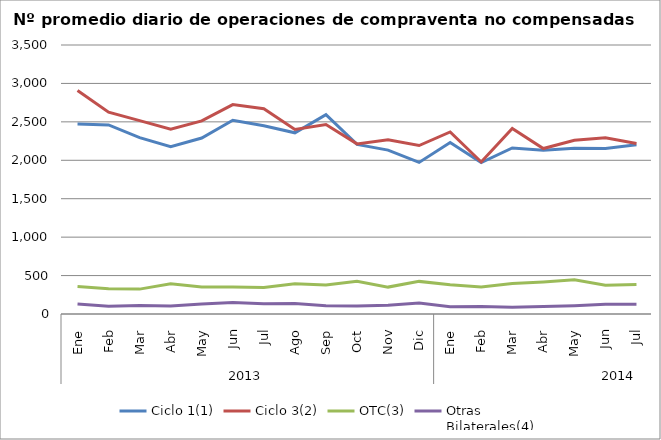
| Category | Ciclo 1(1) | Ciclo 3(2) | OTC(3) | Otras
Bilaterales(4) |
|---|---|---|---|---|
| 0 | 2472.091 | 2907.273 | 357.864 | 131.409 |
| 1 | 2459.8 | 2626.25 | 327.5 | 100.6 |
| 2 | 2294.6 | 2516 | 323.75 | 111.65 |
| 3 | 2176.182 | 2403.364 | 394.818 | 103.364 |
| 4 | 2290.048 | 2512.714 | 352.095 | 130.143 |
| 5 | 2520.75 | 2724.25 | 349.7 | 151.05 |
| 6 | 2449.045 | 2670.182 | 344.818 | 134.5 |
| 7 | 2357.333 | 2400.048 | 392.524 | 137.571 |
| 8 | 2593.778 | 2465 | 376.889 | 108.389 |
| 9 | 2205.955 | 2213.318 | 425.318 | 105.636 |
| 10 | 2132.1 | 2268.1 | 350 | 113.75 |
| 11 | 1972.35 | 2191.55 | 424.35 | 141.55 |
| 12 | 2231.227 | 2368.955 | 379.864 | 95 |
| 13 | 1969.85 | 1978.25 | 352.25 | 97.9 |
| 14 | 2160.619 | 2415.286 | 395.857 | 87.762 |
| 15 | 2130.667 | 2153.048 | 416.143 | 96 |
| 16 | 2155.9 | 2259.8 | 444.8 | 108.2 |
| 17 | 2153.571 | 2294.381 | 375.286 | 126.095 |
| 18 | 2203.545 | 2217.727 | 382.409 | 125.409 |